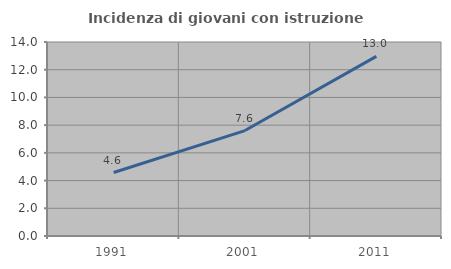
| Category | Incidenza di giovani con istruzione universitaria |
|---|---|
| 1991.0 | 4.58 |
| 2001.0 | 7.609 |
| 2011.0 | 12.963 |